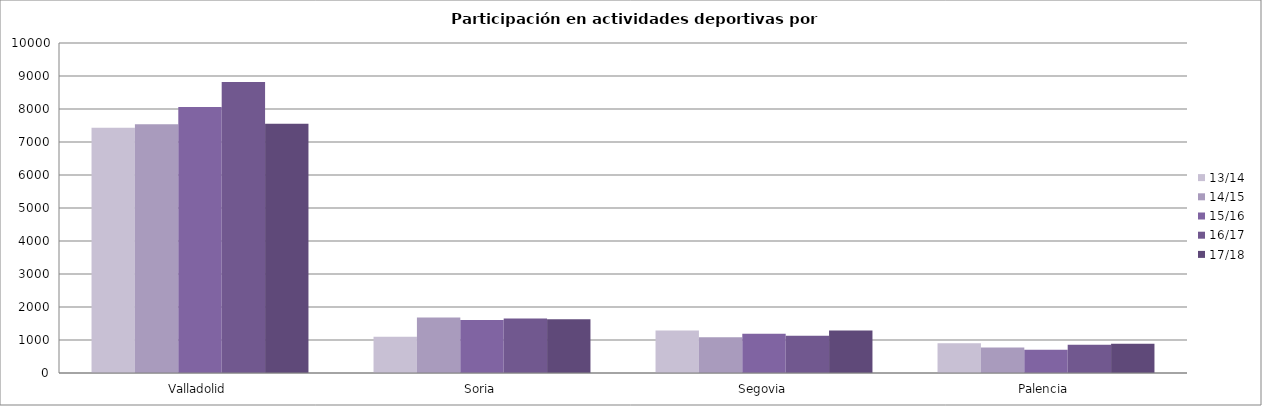
| Category | 13/14 | 14/15 | 15/16 | 16/17 | 17/18 |
|---|---|---|---|---|---|
| Valladolid | 7431 | 7535 | 8061 | 8815 | 7553 |
| Soria | 1096 | 1684 | 1603 | 1651 | 1629 |
| Segovia | 1289 | 1080 | 1188 | 1132 | 1285 |
| Palencia | 898 | 771 | 703 | 853 | 890 |